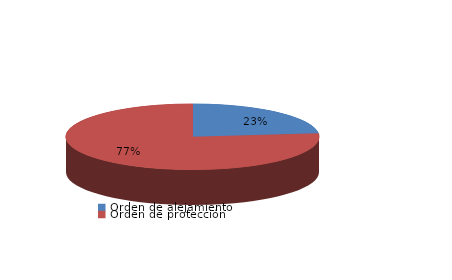
| Category | Series 0 |
|---|---|
| Orden de alejamiento | 230 |
| Orden de protección | 760 |